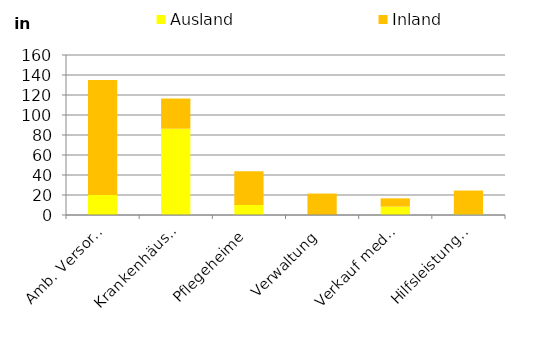
| Category | Ausland | Inland |
|---|---|---|
| Amb. Versorgung | 19941.386 | 114968.018 |
| Krankenhäuser | 86290.535 | 30196.693 |
| Pflegeheime | 10087.634 | 33634.549 |
| Verwaltung | 86.442 | 21373.818 |
| Verkauf med. Güter | 8396.115 | 8252.077 |
| Hilfsleistungen, Prävention, Sonstige | 788.797 | 23670.264 |